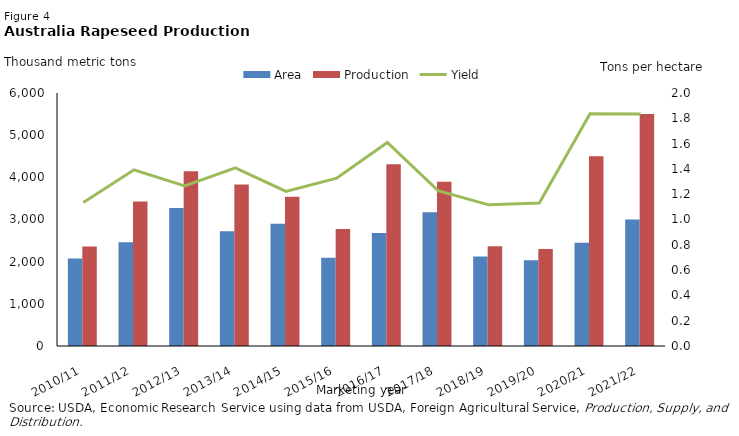
| Category | Area | Production |
|---|---|---|
| 2010/11 | 2078 | 2359 |
| 2011/12 | 2461 | 3427 |
| 2012/13 | 3272 | 4142 |
| 2013/14 | 2721 | 3832 |
| 2014/15 | 2897 | 3540 |
| 2015/16 | 2091 | 2775 |
| 2016/17 | 2681 | 4313 |
| 2017/18 | 3171 | 3893 |
| 2018/19 | 2120 | 2366 |
| 2019/20 | 2034 | 2299 |
| 2020/21 | 2450 | 4500 |
| 2021/22 | 3000 | 5500 |